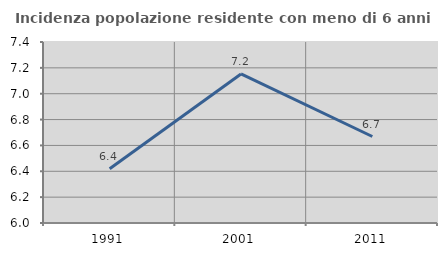
| Category | Incidenza popolazione residente con meno di 6 anni |
|---|---|
| 1991.0 | 6.42 |
| 2001.0 | 7.153 |
| 2011.0 | 6.669 |